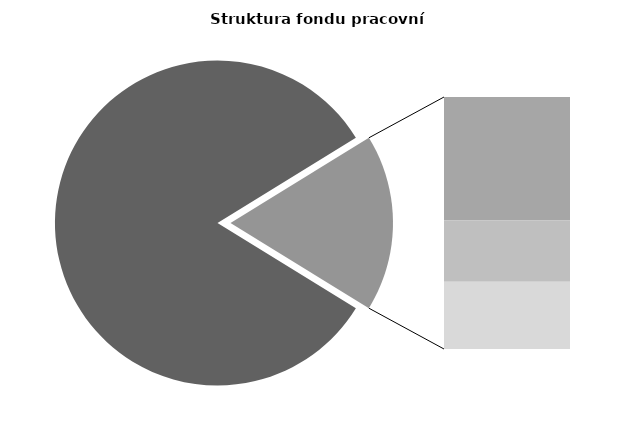
| Category | Series 0 |
|---|---|
| Průměrná měsíční odpracovaná doba bez přesčasu | 139.172 |
| Dovolená | 14.512 |
| Nemoc | 7.243 |
| Jiné | 7.903 |